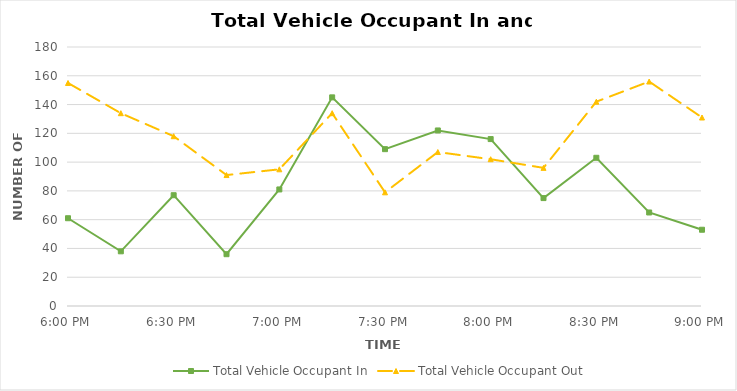
| Category | Total Vehicle Occupant In | Total Vehicle Occupant Out |
|---|---|---|
| 0.75 | 61 | 155 |
| 0.7604166666666666 | 38 | 134 |
| 0.7708333333333334 | 77 | 118 |
| 0.78125 | 36 | 91 |
| 0.7916666666666666 | 81 | 95 |
| 0.8020833333333334 | 145 | 134 |
| 0.8125 | 109 | 79 |
| 0.8229166666666666 | 122 | 107 |
| 0.8333333333333334 | 116 | 102 |
| 0.84375 | 75 | 96 |
| 0.8541666666666666 | 103 | 142 |
| 0.8645833333333334 | 65 | 156 |
| 0.875 | 53 | 131 |